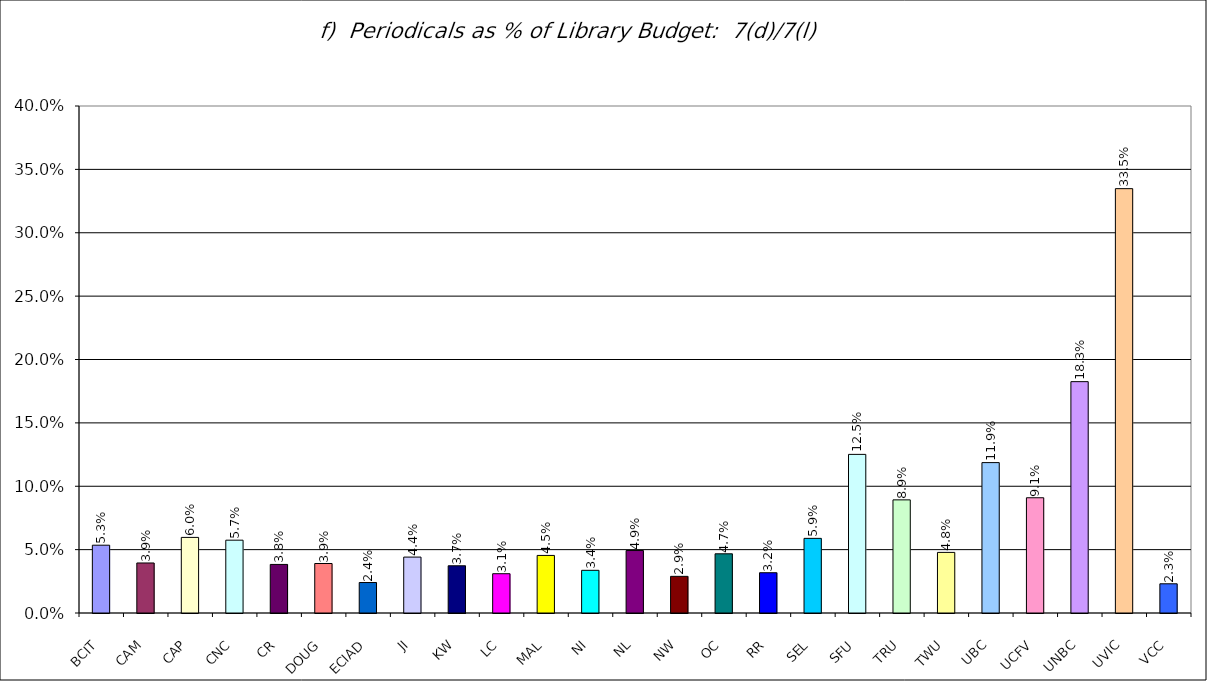
| Category | f)  Periodicals as % of Library Budget:  7(d)/7(l) |
|---|---|
| BCIT | 0.053 |
| CAM | 0.039 |
| CAP | 0.06 |
| CNC | 0.057 |
| CR | 0.038 |
| DOUG | 0.039 |
| ECIAD | 0.024 |
| JI | 0.044 |
| KW | 0.037 |
| LC | 0.031 |
| MAL | 0.045 |
| NI | 0.034 |
| NL | 0.049 |
| NW | 0.029 |
| OC | 0.047 |
| RR | 0.032 |
| SEL | 0.059 |
| SFU | 0.125 |
| TRU | 0.089 |
| TWU | 0.048 |
| UBC | 0.119 |
| UCFV | 0.091 |
| UNBC | 0.183 |
| UVIC | 0.335 |
| VCC | 0.023 |